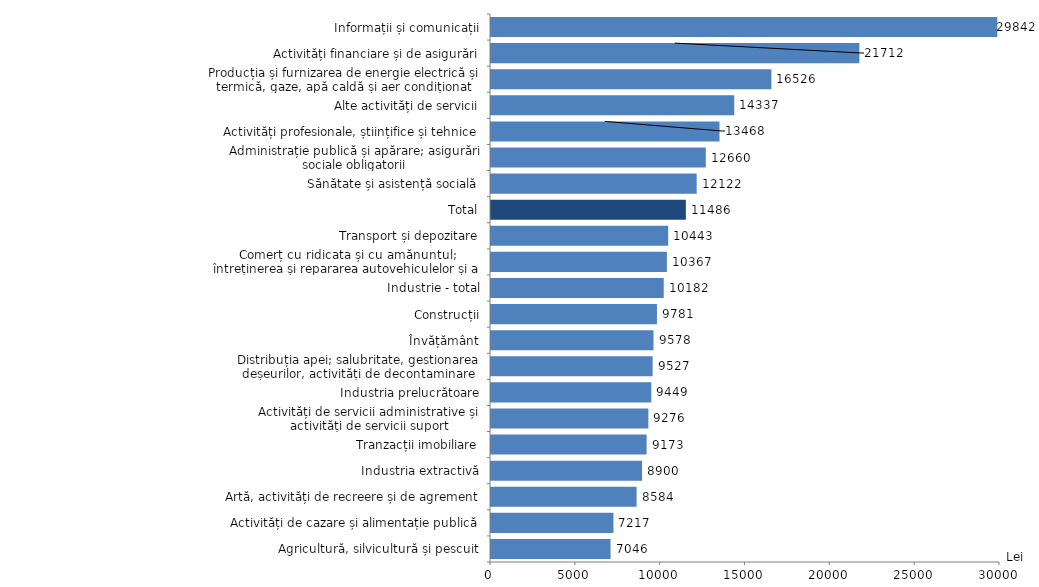
| Category | Lei |
|---|---|
| Agricultură, silvicultură și pescuit | 7046.4 |
| Activități de cazare și alimentație publică | 7217 |
| Artă, activități de recreere și de agrement | 8583.6 |
| Industria extractivă | 8900.1 |
| Tranzacții imobiliare | 9173 |
| Activități de servicii administrative și activități de servicii suport | 9275.9 |
| Industria prelucrătoare | 9448.6 |
| Distribuția apei; salubritate, gestionarea deșeurilor, activități de decontaminare | 9526.6 |
| Învățământ | 9577.7 |
| Construcții | 9780.5 |
| Industrie - total | 10181.5 |
| Comerț cu ridicata și cu amănuntul; întreținerea și repararea autovehiculelor și a motocicletelor | 10366.5 |
| Transport și depozitare | 10442.6 |
| Total | 11486.2 |
| Sănătate și asistență socială | 12122 |
| Administrație publică și apărare; asigurări sociale obligatorii | 12659.7 |
| Activități profesionale, științifice și tehnice | 13467.8 |
| Alte activități de servicii | 14337.1 |
| Producția și furnizarea de energie electrică și termică, gaze, apă caldă și aer condiționat | 16526.4 |
| Activități financiare și de asigurări | 21711.9 |
| Informații și comunicații | 29841.8 |